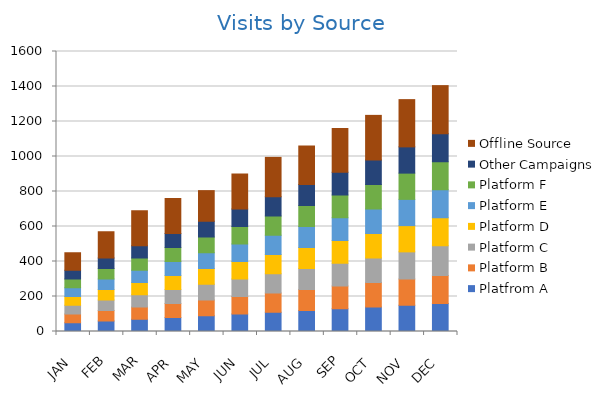
| Category | Platfrom A | Platform B | Platform C | Platform D | Platform E | Platform F | Other Campaigns | Offline Source |
|---|---|---|---|---|---|---|---|---|
| JAN | 50 | 50 | 50 | 50 | 50 | 50 | 50 | 100 |
| FEB | 60 | 60 | 60 | 60 | 60 | 60 | 60 | 150 |
| MAR | 70 | 70 | 70 | 70 | 70 | 70 | 70 | 200 |
| APR | 80 | 80 | 80 | 80 | 80 | 80 | 80 | 200 |
| MAY | 90 | 90 | 90 | 90 | 90 | 90 | 90 | 175 |
| JUN | 100 | 100 | 100 | 100 | 100 | 100 | 100 | 200 |
| JUL | 110 | 110 | 110 | 110 | 110 | 110 | 110 | 225 |
| AUG | 120 | 120 | 120 | 120 | 120 | 120 | 120 | 220 |
| SEP | 130 | 130 | 130 | 130 | 130 | 130 | 130 | 250 |
| OCT | 140 | 140 | 140 | 140 | 140 | 140 | 140 | 255 |
| NOV | 150 | 150 | 155 | 150 | 150 | 150 | 150 | 270 |
| DEC | 160 | 160 | 170 | 160 | 160 | 160 | 160 | 275 |